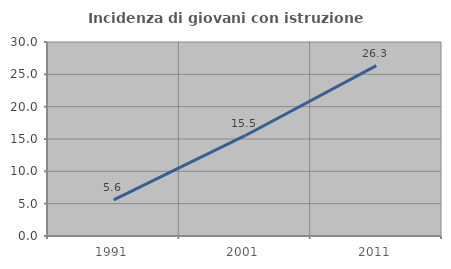
| Category | Incidenza di giovani con istruzione universitaria |
|---|---|
| 1991.0 | 5.581 |
| 2001.0 | 15.508 |
| 2011.0 | 26.344 |